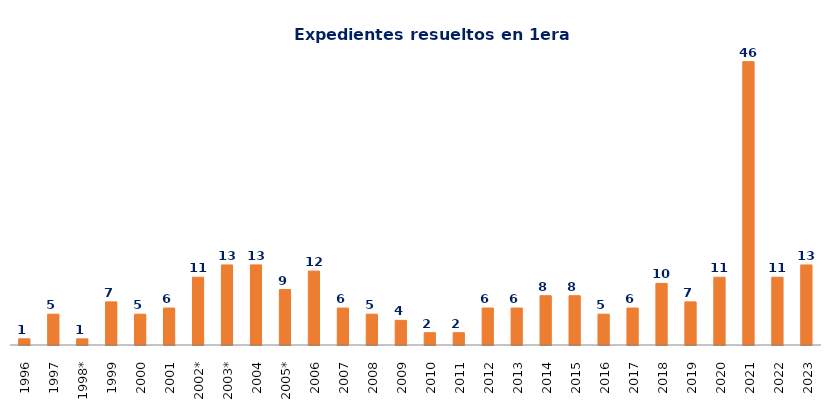
| Category | Resueltos |
|---|---|
| 1996 | 1 |
| 1997 | 5 |
| 1998* | 1 |
| 1999 | 7 |
| 2000 | 5 |
| 2001 | 6 |
| 2002* | 11 |
| 2003* | 13 |
| 2004 | 13 |
| 2005* | 9 |
| 2006 | 12 |
| 2007 | 6 |
| 2008 | 5 |
| 2009 | 4 |
| 2010 | 2 |
| 2011 | 2 |
| 2012 | 6 |
| 2013 | 6 |
| 2014 | 8 |
| 2015 | 8 |
| 2016 | 5 |
| 2017 | 6 |
| 2018 | 10 |
| 2019 | 7 |
| 2020 | 11 |
| 2021 | 46 |
| 2022 | 11 |
| 2023 | 13 |